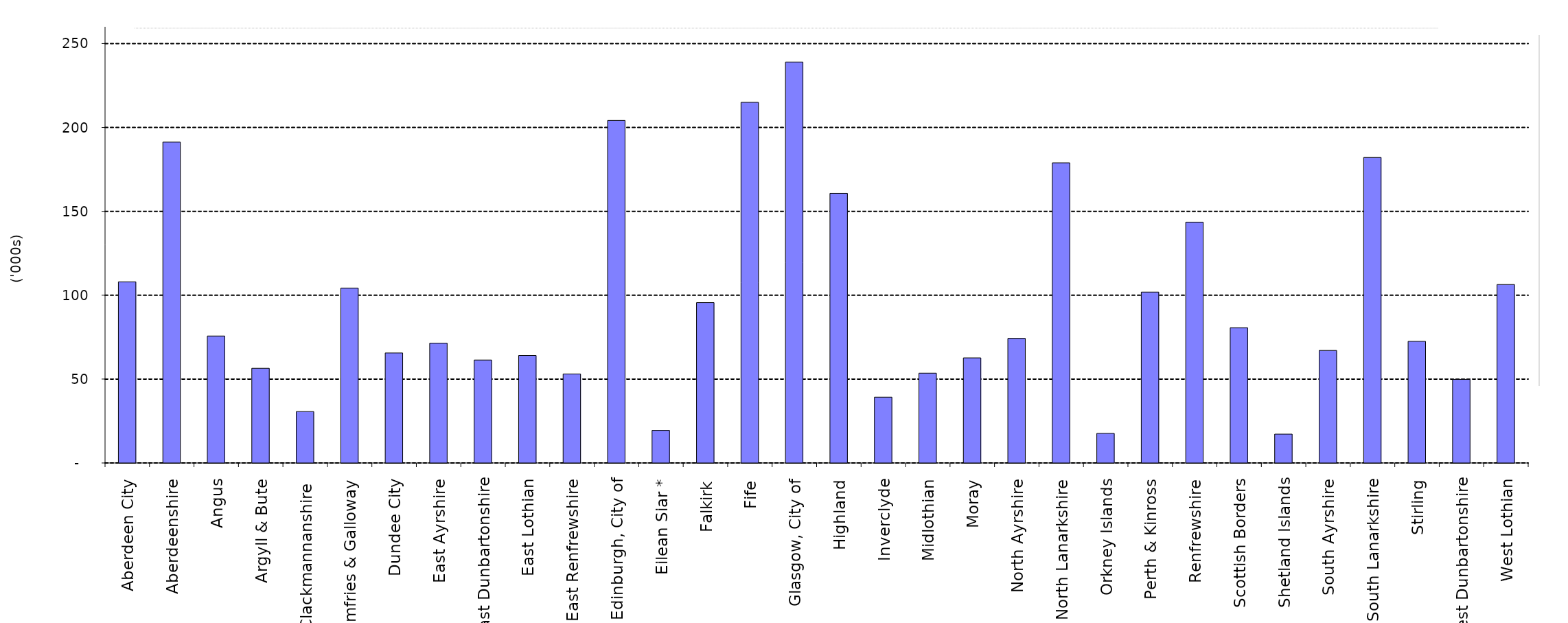
| Category | Series 0 |
|---|---|
| Aberdeen City | 107.984 |
| Aberdeenshire | 191.26 |
| Angus | 75.664 |
| Argyll & Bute | 56.415 |
| Clackmannanshire  | 30.634 |
| Dumfries & Galloway | 104.275 |
| Dundee City | 65.559 |
| East Ayrshire | 71.419 |
| East Dunbartonshire | 61.341 |
| East Lothian | 64.069 |
| East Renfrewshire | 53.059 |
| Edinburgh, City of | 204.163 |
| Eilean Siar * | 19.401 |
| Falkirk | 95.583 |
| Fife | 214.965 |
| Glasgow, City of | 239.008 |
| Highland | 160.723 |
| Inverclyde | 39.207 |
| Midlothian | 53.526 |
| Moray | 62.631 |
| North Ayrshire | 74.248 |
| North Lanarkshire | 178.911 |
| Orkney Islands | 17.62 |
| Perth & Kinross | 101.856 |
| Renfrewshire | 143.551 |
| Scottish Borders | 80.635 |
| Shetland Islands | 17.18 |
| South Ayrshire | 67.062 |
| South Lanarkshire | 182.094 |
| Stirling | 72.479 |
| West Dunbartonshire | 49.804 |
| West Lothian | 106.355 |